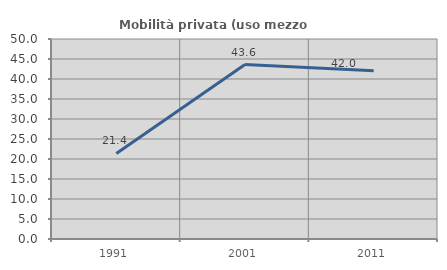
| Category | Mobilità privata (uso mezzo privato) |
|---|---|
| 1991.0 | 21.384 |
| 2001.0 | 43.609 |
| 2011.0 | 42.038 |